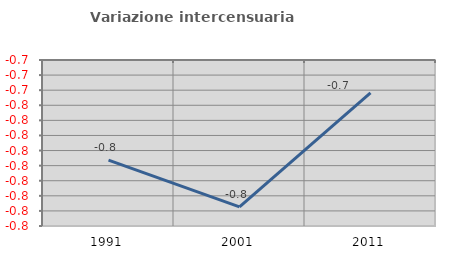
| Category | Variazione intercensuaria annua |
|---|---|
| 1991.0 | -0.786 |
| 2001.0 | -0.817 |
| 2011.0 | -0.742 |